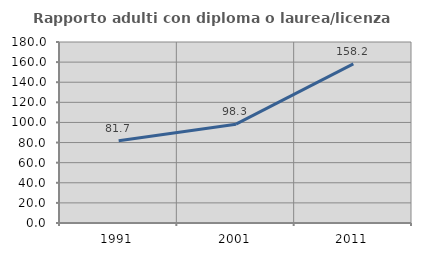
| Category | Rapporto adulti con diploma o laurea/licenza media  |
|---|---|
| 1991.0 | 81.72 |
| 2001.0 | 98.283 |
| 2011.0 | 158.163 |